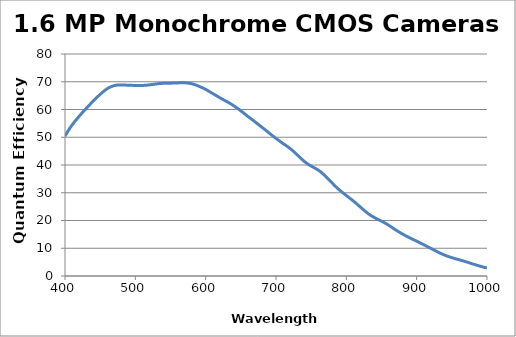
| Category | Quantum Efficiency (%) |
|---|---|
| 400.0 | 50.396 |
| 405.0 | 52.527 |
| 410.0 | 54.378 |
| 415.0 | 56.024 |
| 420.0 | 57.509 |
| 425.0 | 58.97 |
| 430.0 | 60.36 |
| 435.0 | 61.697 |
| 440.0 | 63.001 |
| 445.0 | 64.277 |
| 450.0 | 65.449 |
| 455.0 | 66.558 |
| 460.0 | 67.49 |
| 465.0 | 68.163 |
| 470.0 | 68.614 |
| 475.0 | 68.83 |
| 480.0 | 68.83 |
| 485.0 | 68.795 |
| 490.0 | 68.764 |
| 495.0 | 68.704 |
| 500.0 | 68.674 |
| 505.0 | 68.678 |
| 510.0 | 68.674 |
| 515.0 | 68.738 |
| 520.0 | 68.875 |
| 525.0 | 69.044 |
| 530.0 | 69.206 |
| 535.0 | 69.362 |
| 540.0 | 69.434 |
| 545.0 | 69.469 |
| 550.0 | 69.487 |
| 555.0 | 69.519 |
| 560.0 | 69.566 |
| 565.0 | 69.642 |
| 570.0 | 69.626 |
| 575.0 | 69.511 |
| 580.0 | 69.299 |
| 585.0 | 68.935 |
| 590.0 | 68.425 |
| 595.0 | 67.868 |
| 600.0 | 67.248 |
| 605.0 | 66.516 |
| 610.0 | 65.759 |
| 615.0 | 65.017 |
| 620.0 | 64.264 |
| 625.0 | 63.525 |
| 630.0 | 62.862 |
| 635.0 | 62.151 |
| 640.0 | 61.33 |
| 645.0 | 60.44 |
| 650.0 | 59.516 |
| 655.0 | 58.518 |
| 660.0 | 57.514 |
| 665.0 | 56.556 |
| 670.0 | 55.59 |
| 675.0 | 54.592 |
| 680.0 | 53.601 |
| 685.0 | 52.614 |
| 690.0 | 51.581 |
| 695.0 | 50.567 |
| 700.0 | 49.591 |
| 705.0 | 48.652 |
| 710.0 | 47.745 |
| 715.0 | 46.884 |
| 720.0 | 45.943 |
| 725.0 | 44.881 |
| 730.0 | 43.699 |
| 735.0 | 42.485 |
| 740.0 | 41.347 |
| 745.0 | 40.399 |
| 750.0 | 39.62 |
| 755.0 | 38.915 |
| 760.0 | 38.162 |
| 765.0 | 37.215 |
| 770.0 | 36.069 |
| 775.0 | 34.781 |
| 780.0 | 33.47 |
| 785.0 | 32.194 |
| 790.0 | 31.041 |
| 795.0 | 29.99 |
| 800.0 | 29.005 |
| 805.0 | 28.024 |
| 810.0 | 27.016 |
| 815.0 | 25.953 |
| 820.0 | 24.836 |
| 825.0 | 23.725 |
| 830.0 | 22.698 |
| 835.0 | 21.81 |
| 840.0 | 21.052 |
| 845.0 | 20.396 |
| 850.0 | 19.764 |
| 855.0 | 19.079 |
| 860.0 | 18.309 |
| 865.0 | 17.481 |
| 870.0 | 16.644 |
| 875.0 | 15.844 |
| 880.0 | 15.106 |
| 885.0 | 14.428 |
| 890.0 | 13.791 |
| 895.0 | 13.166 |
| 900.0 | 12.548 |
| 905.0 | 11.924 |
| 910.0 | 11.287 |
| 915.0 | 10.633 |
| 920.0 | 9.972 |
| 925.0 | 9.305 |
| 930.0 | 8.653 |
| 935.0 | 8.048 |
| 940.0 | 7.507 |
| 945.0 | 7.032 |
| 950.0 | 6.617 |
| 955.0 | 6.244 |
| 960.0 | 5.886 |
| 965.0 | 5.52 |
| 970.0 | 5.137 |
| 975.0 | 4.738 |
| 980.0 | 4.331 |
| 985.0 | 3.93 |
| 990.0 | 3.561 |
| 995.0 | 3.196 |
| 1000.0 | 2.902 |